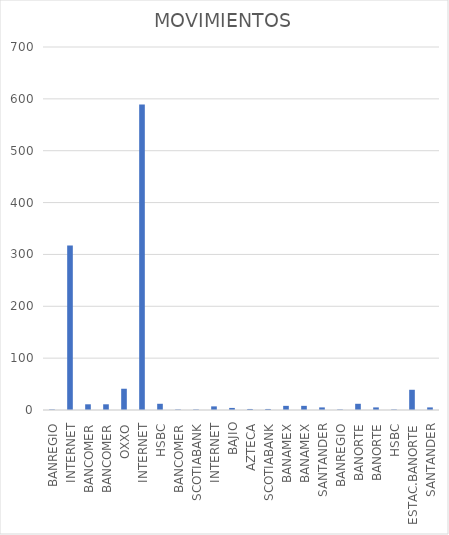
| Category | MOVIMIENTOS |
|---|---|
| BANREGIO | 1 |
| INTERNET | 317 |
| BANCOMER | 11 |
| BANCOMER | 11 |
| OXXO | 41 |
| INTERNET | 589 |
| HSBC | 12 |
| BANCOMER | 1 |
| SCOTIABANK | 1 |
| INTERNET | 7 |
| BAJIO | 4 |
| AZTECA | 2 |
| SCOTIABANK | 2 |
| BANAMEX | 8 |
| BANAMEX | 8 |
| SANTANDER | 5 |
| BANREGIO | 1 |
| BANORTE | 12 |
| BANORTE | 5 |
| HSBC | 1 |
| ESTAC.BANORTE | 39 |
| SANTANDER | 5 |